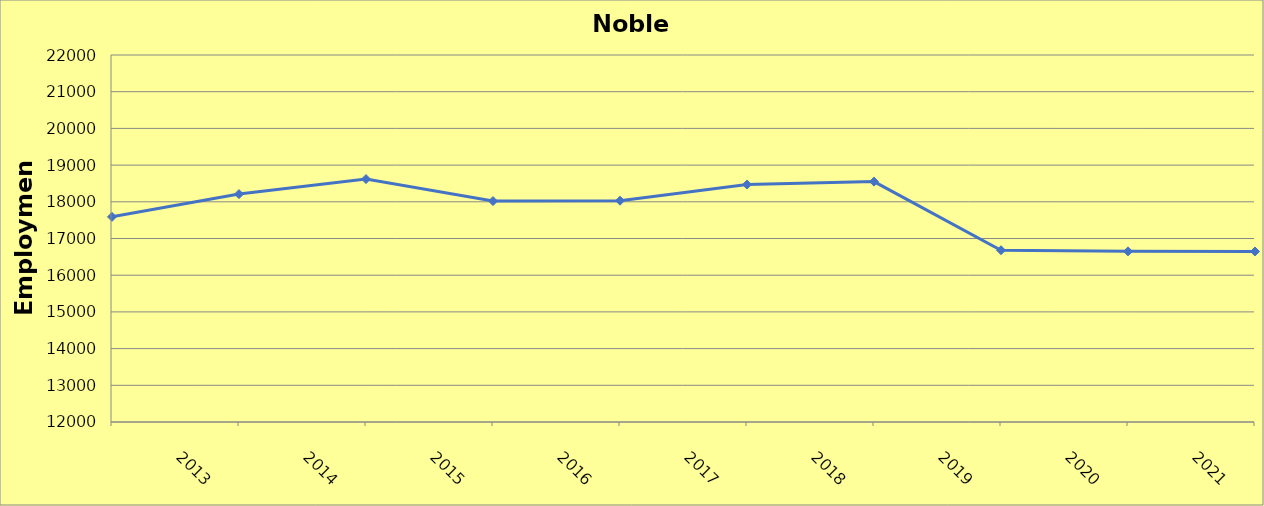
| Category | Noble County |
|---|---|
| 2013.0 | 17590 |
| 2014.0 | 18210 |
| 2015.0 | 18620 |
| 2016.0 | 18020 |
| 2017.0 | 18030 |
| 2018.0 | 18470 |
| 2019.0 | 18550 |
| 2020.0 | 16680 |
| 2021.0 | 16650 |
| 2022.0 | 16647 |